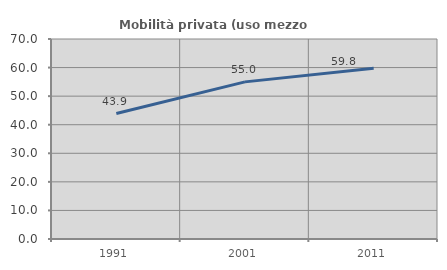
| Category | Mobilità privata (uso mezzo privato) |
|---|---|
| 1991.0 | 43.921 |
| 2001.0 | 54.991 |
| 2011.0 | 59.787 |